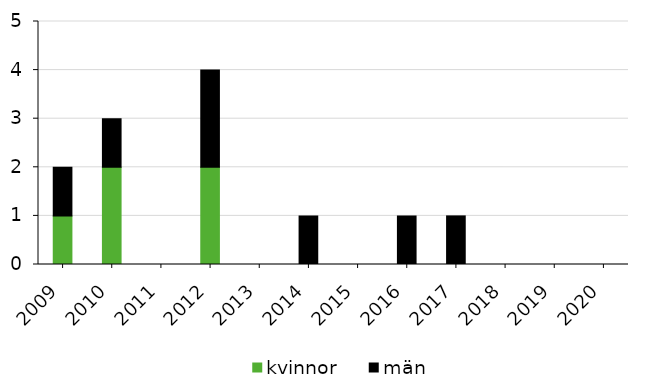
| Category | kvinnor | män |
|---|---|---|
| 2009 | 1 | 1 |
| 2010 | 2 | 1 |
| 2011 | 0 | 0 |
| 2012 | 2 | 2 |
| 2013 | 0 | 0 |
| 2014 | 0 | 1 |
| 2015 | 0 | 0 |
| 2016 | 0 | 1 |
| 2017 | 0 | 1 |
| 2018 | 0 | 0 |
| 2019 | 0 | 0 |
| 2020 | 0 | 0 |